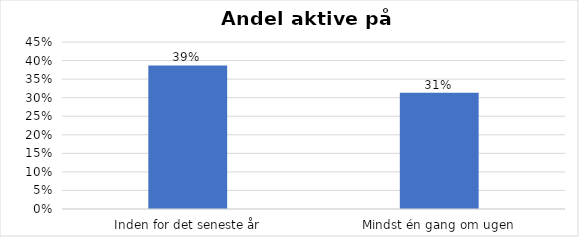
| Category | % |
|---|---|
| Inden for det seneste år | 0.387 |
| Mindst én gang om ugen | 0.313 |